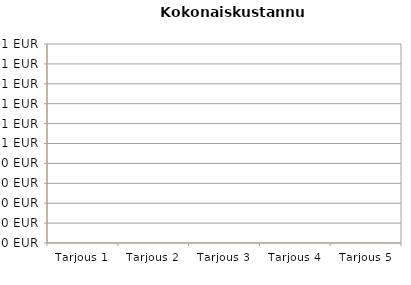
| Category | LCC YHTEENSÄ |
|---|---|
| Tarjous 1 | 0 |
| Tarjous 2 | 0 |
| Tarjous 3 | 0 |
| Tarjous 4 | 0 |
| Tarjous 5 | 0 |